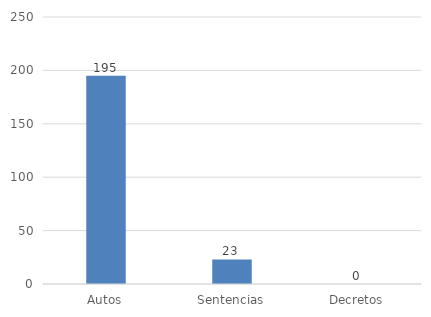
| Category | Series 0 |
|---|---|
| Autos | 195 |
| Sentencias | 23 |
| Decretos | 0 |